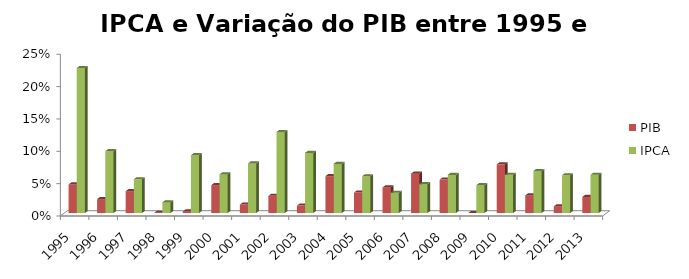
| Category | PIB | IPCA |
|---|---|---|
| 1995.0 | 0.044 | 0.224 |
| 1996.0 | 0.022 | 0.096 |
| 1997.0 | 0.034 | 0.052 |
| 1998.0 | 0 | 0.016 |
| 1999.0 | 0.002 | 0.089 |
| 2000.0 | 0.043 | 0.06 |
| 2001.0 | 0.013 | 0.077 |
| 2002.0 | 0.027 | 0.125 |
| 2003.0 | 0.012 | 0.093 |
| 2004.0 | 0.057 | 0.076 |
| 2005.0 | 0.032 | 0.057 |
| 2006.0 | 0.04 | 0.031 |
| 2007.0 | 0.061 | 0.045 |
| 2008.0 | 0.052 | 0.059 |
| 2009.0 | -0.003 | 0.043 |
| 2010.0 | 0.075 | 0.059 |
| 2011.0 | 0.027 | 0.065 |
| 2012.0 | 0.01 | 0.058 |
| 2013.0 | 0.025 | 0.059 |